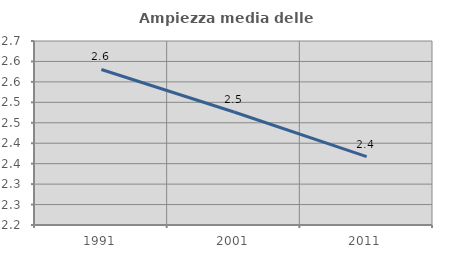
| Category | Ampiezza media delle famiglie |
|---|---|
| 1991.0 | 2.58 |
| 2001.0 | 2.476 |
| 2011.0 | 2.367 |